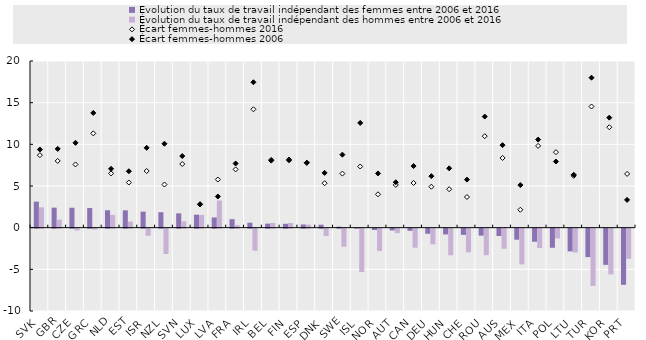
| Category | Évolution du taux de travail indépendant des femmes entre 2006 et 2016 | Évolution du taux de travail indépendant des hommes entre 2006 et 2016 |
|---|---|---|
| SVK | 3.119 | 2.441 |
| GBR | 2.404 | 0.961 |
| CZE | 2.391 | -0.209 |
| GRC | 2.355 | -0.095 |
| NLD | 2.089 | 1.54 |
| EST | 2.08 | 0.725 |
| ISR | 1.923 | -0.857 |
| NZL | 1.854 | -3.039 |
| SVN | 1.717 | 0.76 |
| LUX | 1.557 | 1.527 |
| LVA | 1.225 | 3.264 |
| FRA | 1.02 | 0.307 |
| IRL | 0.596 | -2.651 |
| BEL | 0.483 | 0.573 |
| FIN | 0.465 | 0.555 |
| ESP | 0.38 | 0.365 |
| DNK | 0.356 | -0.885 |
| SWE | 0.115 | -2.16 |
| ISL | 0.023 | -5.207 |
| NOR | -0.162 | -2.671 |
| AUT | -0.21 | -0.532 |
| CAN | -0.258 | -2.285 |
| DEU | -0.61 | -1.876 |
| HUN | -0.69 | -3.193 |
| CHE | -0.747 | -2.833 |
| ROU | -0.837 | -3.188 |
| AUS | -0.877 | -2.411 |
| MEX | -1.325 | -4.285 |
| ITA | -1.568 | -2.323 |
| POL | -2.292 | -1.17 |
| LTU | -2.726 | -2.857 |
| TUR | -3.415 | -6.873 |
| KOR | -4.342 | -5.492 |
| PRT | -6.738 | -3.618 |